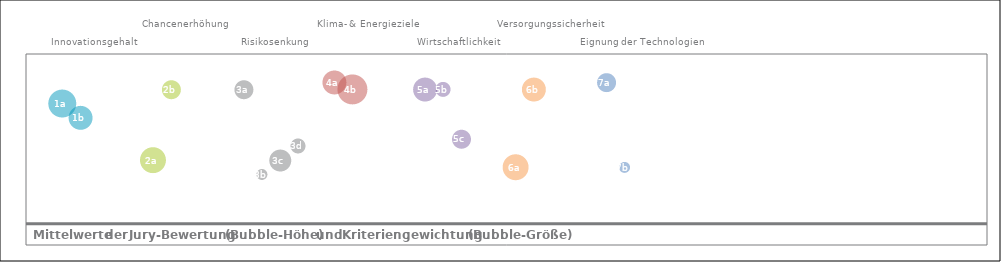
| Category | Mittelwert |
|---|---|
| 0 | 2.833 |
| 1 | 2.5 |
| 2 | 0 |
| 3 | 0 |
| 4 | 0 |
| 5 | 1.5 |
| 6 | 3.167 |
| 7 | 0 |
| 8 | 0 |
| 9 | 0 |
| 10 | 3.167 |
| 11 | 1.167 |
| 12 | 1.5 |
| 13 | 1.833 |
| 14 | 0 |
| 15 | 3.333 |
| 16 | 3.167 |
| 17 | 0 |
| 18 | 0 |
| 19 | 0 |
| 20 | 3.167 |
| 21 | 3.167 |
| 22 | 2 |
| 23 | 0 |
| 24 | 0 |
| 25 | 1.333 |
| 26 | 3.167 |
| 27 | 0 |
| 28 | 0 |
| 29 | 0 |
| 30 | 3.333 |
| 31 | 1.333 |
| 32 | 0 |
| 33 | 0 |
| 34 | 0 |
| 35 | 0 |
| 36 | 0 |
| 37 | 0 |
| 38 | 0 |
| 39 | 0 |
| 40 | 0 |
| 41 | 0 |
| 42 | 0 |
| 43 | 0 |
| 44 | 0 |
| 45 | 0 |
| 46 | 0 |
| 47 | 0 |
| 48 | 0 |
| 49 | 0 |